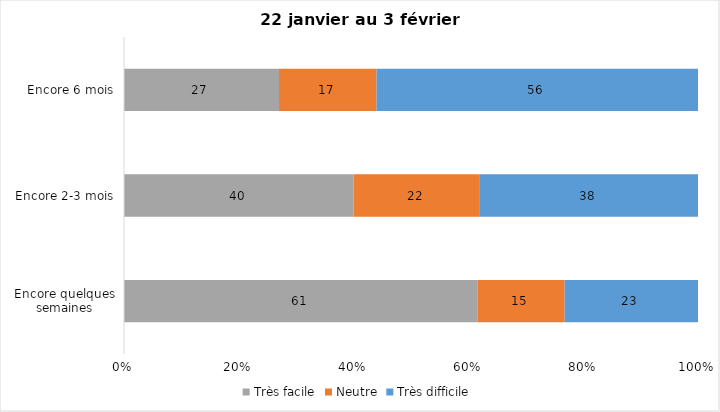
| Category | Très facile | Neutre | Très difficile |
|---|---|---|---|
| Encore quelques semaines | 61 | 15 | 23 |
| Encore 2-3 mois | 40 | 22 | 38 |
| Encore 6 mois | 27 | 17 | 56 |